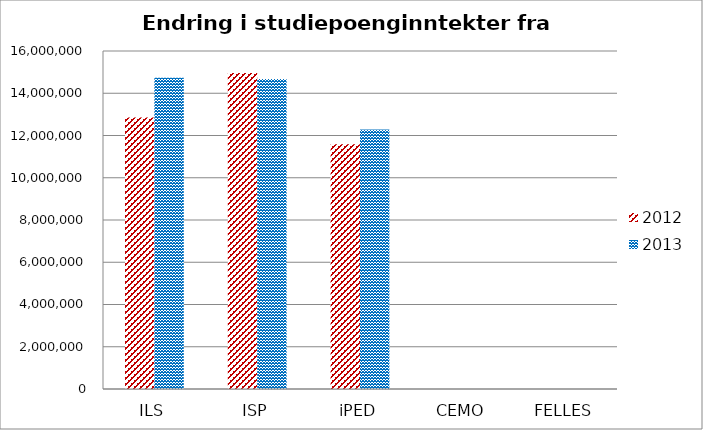
| Category | 2012 | 2013 |
|---|---|---|
| ILS | 12854767 | 14733733.333 |
| ISP | 14954033 | 14678000 |
| iPED | 11582100 | 12289733.333 |
| CEMO | 0 | 0 |
| FELLES | 0 | 0 |